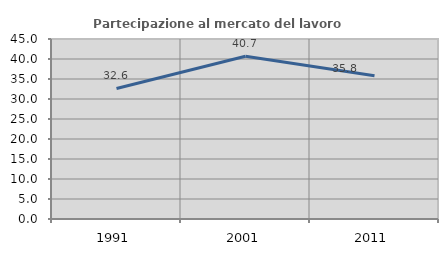
| Category | Partecipazione al mercato del lavoro  femminile |
|---|---|
| 1991.0 | 32.639 |
| 2001.0 | 40.698 |
| 2011.0 | 35.802 |